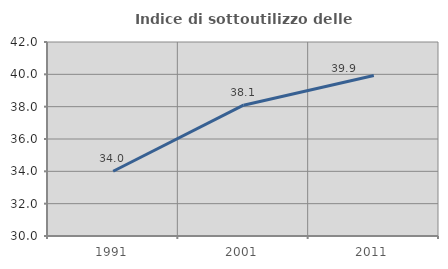
| Category | Indice di sottoutilizzo delle abitazioni  |
|---|---|
| 1991.0 | 34.006 |
| 2001.0 | 38.092 |
| 2011.0 | 39.926 |